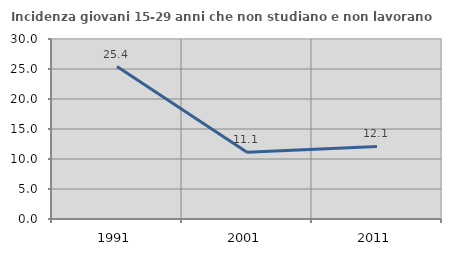
| Category | Incidenza giovani 15-29 anni che non studiano e non lavorano  |
|---|---|
| 1991.0 | 25.414 |
| 2001.0 | 11.111 |
| 2011.0 | 12.088 |